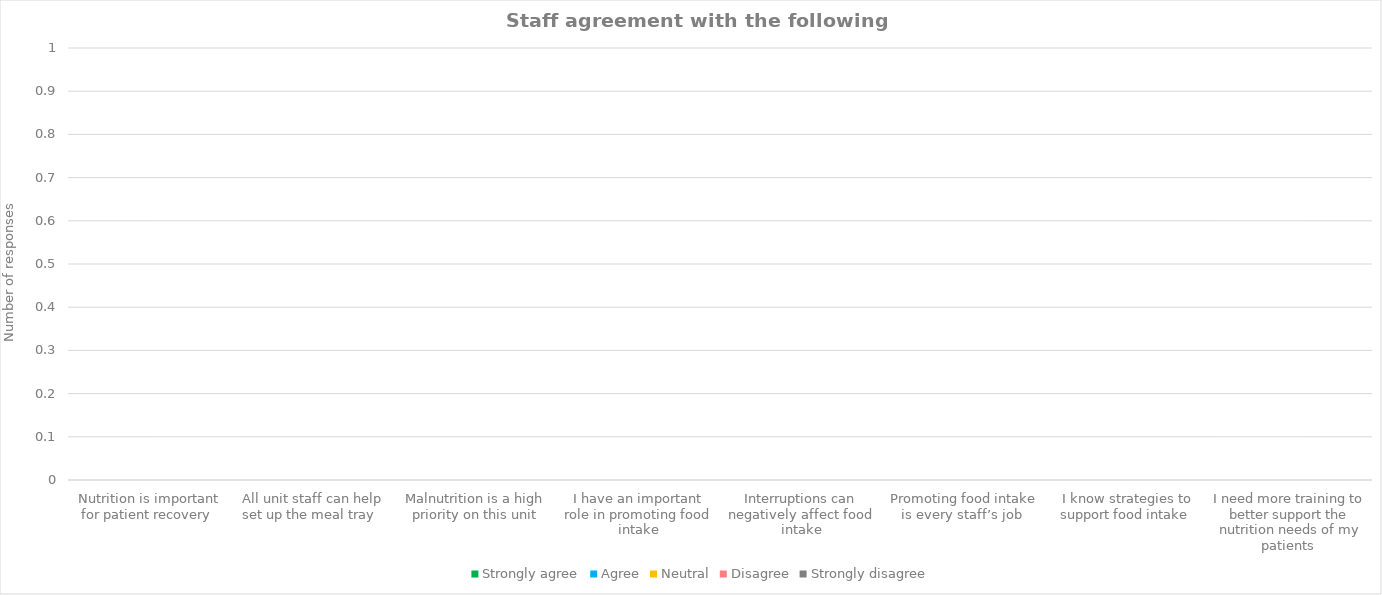
| Category | Strongly agree | Agree | Neutral | Disagree | Strongly disagree |
|---|---|---|---|---|---|
| Nutrition is important for patient recovery  | 0 | 0 | 0 | 0 | 0 |
| All unit staff can help set up the meal tray  | 0 | 0 | 0 | 0 | 0 |
| Malnutrition is a high priority on this unit | 0 | 0 | 0 | 0 | 0 |
| I have an important role in promoting food intake | 0 | 0 | 0 | 0 | 0 |
| Interruptions can negatively affect food intake | 0 | 0 | 0 | 0 | 0 |
| Promoting food intake is every staff’s job  | 0 | 0 | 0 | 0 | 0 |
| I know strategies to support food intake  | 0 | 0 | 0 | 0 | 0 |
| I need more training to better support the nutrition needs of my patients  | 0 | 0 | 0 | 0 | 0 |